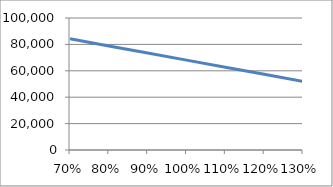
| Category | Series 0 |
|---|---|
| 0.7 | 84222.938 |
| 0.8 | 78847.938 |
| 0.9 | 73472.938 |
| 1.0 | 68097.938 |
| 1.1 | 62722.938 |
| 1.2 | 57347.938 |
| 1.3 | 51972.938 |